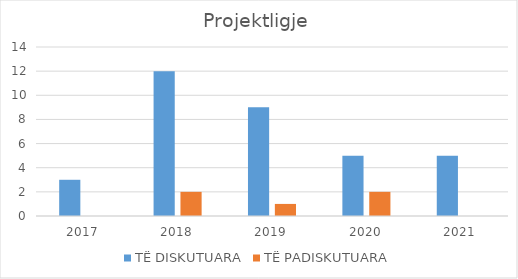
| Category | TË DISKUTUARA | TË PADISKUTUARA |
|---|---|---|
| 2017.0 | 3 | 0 |
| 2018.0 | 12 | 2 |
| 2019.0 | 9 | 1 |
| 2020.0 | 5 | 2 |
| 2021.0 | 5 | 0 |